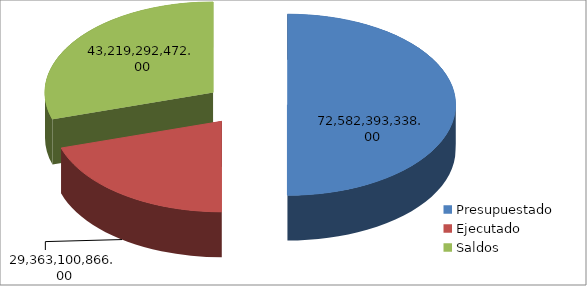
| Category | Series 0 |
|---|---|
| Presupuestado | 72582393338 |
| Ejecutado | 29363100866 |
| Saldos | 43219292472 |